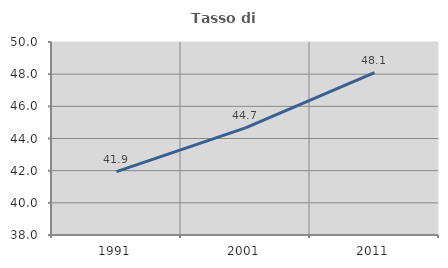
| Category | Tasso di occupazione   |
|---|---|
| 1991.0 | 41.943 |
| 2001.0 | 44.663 |
| 2011.0 | 48.096 |